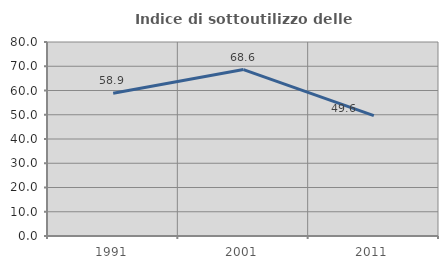
| Category | Indice di sottoutilizzo delle abitazioni  |
|---|---|
| 1991.0 | 58.904 |
| 2001.0 | 68.621 |
| 2011.0 | 49.64 |